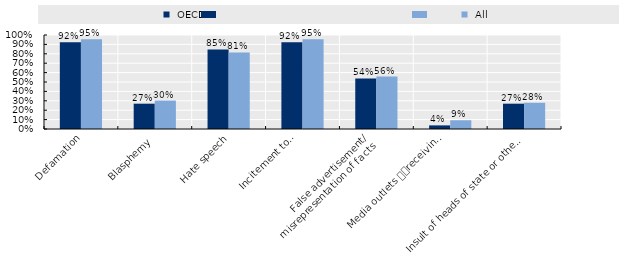
| Category |  OECD |  All |
|---|---|---|
| Defamation | 0.923 | 0.953 |
| Blasphemy  | 0.269 | 0.302 |
| Hate speech | 0.846 | 0.814 |
| Incitement to
 violence/riot | 0.923 | 0.953 |
| False advertisement/
misrepresentation of facts | 0.538 | 0.558 |
| Media outlets 
receiving foreign funding | 0.038 | 0.093 |
| Insult of heads of state or other ruler | 0.269 | 0.279 |